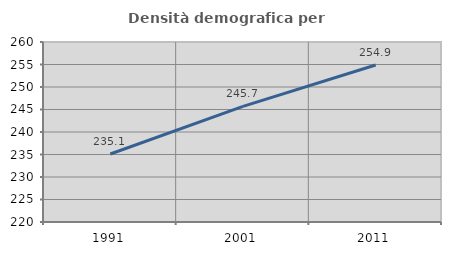
| Category | Densità demografica |
|---|---|
| 1991.0 | 235.104 |
| 2001.0 | 245.689 |
| 2011.0 | 254.879 |